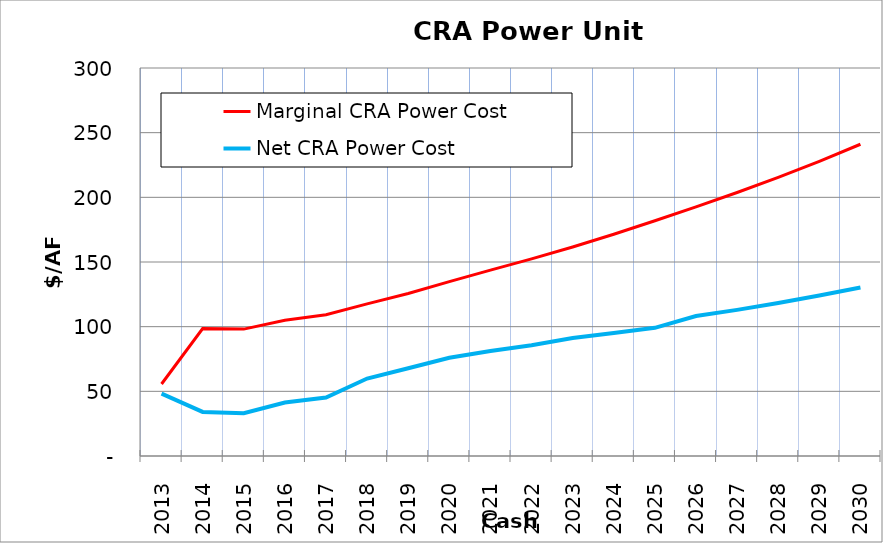
| Category | Marginal CRA Power Cost | Net CRA Power Cost |
|---|---|---|
| 2013.0 | 55.68 | 48.227 |
| 2014.0 | 98.561 | 34.098 |
| 2015.0 | 98.11 | 33.071 |
| 2016.0 | 104.975 | 41.381 |
| 2017.0 | 109.232 | 45.17 |
| 2018.0 | 117.596 | 59.901 |
| 2019.0 | 125.601 | 67.847 |
| 2020.0 | 134.811 | 75.93 |
| 2021.0 | 143.748 | 81.117 |
| 2022.0 | 152.417 | 85.696 |
| 2023.0 | 161.638 | 91.203 |
| 2024.0 | 171.447 | 95.168 |
| 2025.0 | 181.886 | 99.088 |
| 2026.0 | 192.647 | 108.263 |
| 2027.0 | 203.723 | 112.995 |
| 2028.0 | 215.455 | 118.248 |
| 2029.0 | 227.881 | 124.07 |
| 2030.0 | 241.044 | 130.216 |